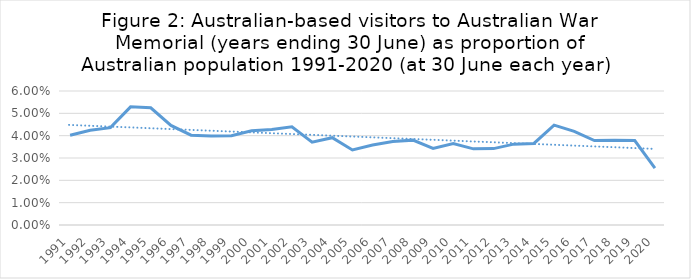
| Category | Series 0 |
|---|---|
| 1991.0 | 0.04 |
| 1992.0 | 0.042 |
| 1993.0 | 0.044 |
| 1994.0 | 0.053 |
| 1995.0 | 0.052 |
| 1996.0 | 0.045 |
| 1997.0 | 0.04 |
| 1998.0 | 0.04 |
| 1999.0 | 0.04 |
| 2000.0 | 0.042 |
| 2001.0 | 0.043 |
| 2002.0 | 0.044 |
| 2003.0 | 0.037 |
| 2004.0 | 0.039 |
| 2005.0 | 0.034 |
| 2006.0 | 0.036 |
| 2007.0 | 0.037 |
| 2008.0 | 0.038 |
| 2009.0 | 0.034 |
| 2010.0 | 0.036 |
| 2011.0 | 0.034 |
| 2012.0 | 0.034 |
| 2013.0 | 0.036 |
| 2014.0 | 0.036 |
| 2015.0 | 0.045 |
| 2016.0 | 0.042 |
| 2017.0 | 0.038 |
| 2018.0 | 0.038 |
| 2019.0 | 0.038 |
| 2020.0 | 0.026 |